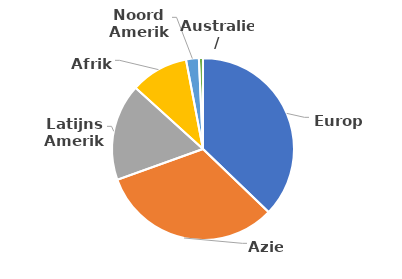
| Category | Series 0 |
|---|---|
| Europa | 21217 |
| Azie | 18436 |
| Latijns Amerika | 9821 |
| Afrika | 5864 |
| Noord Amerika | 1296 |
| Australie/ Oceanie | 414 |